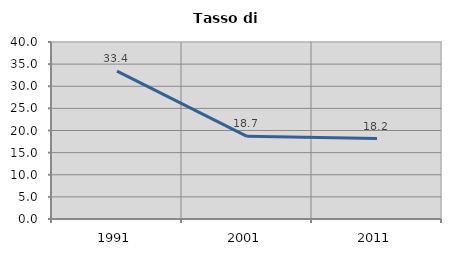
| Category | Tasso di disoccupazione   |
|---|---|
| 1991.0 | 33.4 |
| 2001.0 | 18.689 |
| 2011.0 | 18.182 |